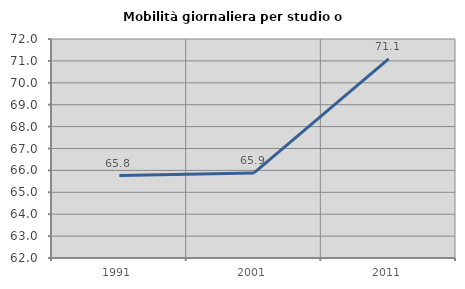
| Category | Mobilità giornaliera per studio o lavoro |
|---|---|
| 1991.0 | 65.764 |
| 2001.0 | 65.885 |
| 2011.0 | 71.097 |